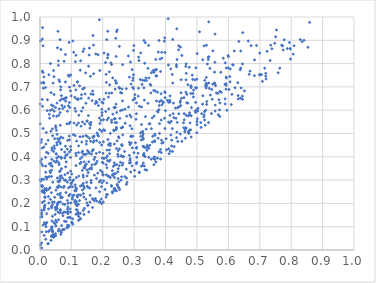
| Category | Series 0 |
|---|---|
| 0.24391119034289943 | 0.937 |
| 0.4676616955791465 | 0.668 |
| 0.5568340997465779 | 0.714 |
| 0.037369161207643664 | 0.389 |
| 0.8533621382588633 | 0.87 |
| 0.10763908088241847 | 0.236 |
| 0.3070902859639657 | 0.436 |
| 0.13458303035295027 | 0.278 |
| 0.3547586632185685 | 0.761 |
| 0.4651976758295102 | 0.73 |
| 0.1837277303432927 | 0.493 |
| 0.14029618347435813 | 0.863 |
| 0.23477067567761456 | 0.515 |
| 0.09814701935426695 | 0.202 |
| 0.14602293796668275 | 0.218 |
| 0.4935495265992197 | 0.73 |
| 0.07887240905222637 | 0.42 |
| 0.20260924000086822 | 0.297 |
| 0.4519171626856099 | 0.466 |
| 0.07965220248888771 | 0.163 |
| 0.041854453100733435 | 0.057 |
| 0.057146219092284456 | 0.939 |
| 0.08839105301547101 | 0.331 |
| 0.05724298066897937 | 0.294 |
| 0.12831150035867 | 0.392 |
| 0.1214229379297539 | 0.649 |
| 0.1949164364507161 | 0.218 |
| 0.013550868993540965 | 0.182 |
| 0.1213459679761526 | 0.646 |
| 0.3762494423564975 | 0.48 |
| 0.7724091463515024 | 0.876 |
| 0.0769640602945596 | 0.088 |
| 0.033231578853792354 | 0.8 |
| 0.14104272610375557 | 0.265 |
| 0.03801853505751707 | 0.439 |
| 0.7942175661114 | 0.891 |
| 0.04299969805753889 | 0.77 |
| 0.11943722633062093 | 0.722 |
| 0.009631824399911615 | 0.876 |
| 0.5242420981090454 | 0.558 |
| 0.5373643796365142 | 0.979 |
| 0.39715830237061955 | 0.911 |
| 0.5618246411263262 | 0.674 |
| 0.2408449500036084 | 0.257 |
| 0.058842929356017426 | 0.205 |
| 0.09546230185449922 | 0.239 |
| 0.1376710891143379 | 0.17 |
| 0.7530375147190279 | 0.944 |
| 0.27501920591225637 | 0.693 |
| 0.3648350697574909 | 0.469 |
| 0.25293504014849844 | 0.434 |
| 0.5329586269067527 | 0.799 |
| 0.8065645198025849 | 0.841 |
| 0.3310262986012268 | 0.414 |
| 0.6000572459547241 | 0.83 |
| 0.22822337867987164 | 0.796 |
| 0.21049090075001964 | 0.754 |
| 0.09763925236492499 | 0.752 |
| 0.01334617480923328 | 0.171 |
| 0.08852334593744193 | 0.156 |
| 0.531127893472464 | 0.706 |
| 0.1401701372584141 | 0.153 |
| 0.21503107951402034 | 0.384 |
| 0.08781193597099624 | 0.106 |
| 0.05449128392824665 | 0.27 |
| 0.2760816050226649 | 0.574 |
| 0.03990961148869476 | 0.49 |
| 0.7329559831619261 | 0.813 |
| 0.00500612260747324 | 0.474 |
| 0.22077620515828122 | 0.765 |
| 0.6054447724367569 | 0.722 |
| 0.32786411738442267 | 0.501 |
| 0.24408991414899306 | 0.547 |
| 0.02527592851926086 | 0.027 |
| 0.11176508920373884 | 0.28 |
| 0.07311101182816859 | 0.147 |
| 0.09266087109593624 | 0.746 |
| 0.2883512260235197 | 0.807 |
| 0.12375368566207612 | 0.317 |
| 0.39871857023153023 | 0.676 |
| 0.4190589228308035 | 0.447 |
| 0.37389502989114665 | 0.595 |
| 0.045309152315040846 | 0.206 |
| 0.5459738909670577 | 0.585 |
| 0.06635398596669262 | 0.08 |
| 0.630844141619654 | 0.663 |
| 0.1520371487880111 | 0.191 |
| 0.4815153798147225 | 0.576 |
| 0.16209924233938278 | 0.669 |
| 0.01787424697789941 | 0.112 |
| 0.183833580432201 | 0.33 |
| 0.04835680129424935 | 0.182 |
| 0.3320016268287741 | 0.361 |
| 0.13812131430080488 | 0.242 |
| 0.05036796216237405 | 0.376 |
| 0.33548523583144896 | 0.89 |
| 0.11575282317948254 | 0.311 |
| 0.3371828985809264 | 0.739 |
| 0.33829220440516306 | 0.439 |
| 0.5992153075573894 | 0.834 |
| 0.07126039271822016 | 0.158 |
| 0.2257562436561359 | 0.803 |
| 0.1695537808601164 | 0.463 |
| 0.20210629621607223 | 0.559 |
| 0.010002813368877761 | 0.248 |
| 0.35996752120817266 | 0.77 |
| 0.40905663588205077 | 0.794 |
| 0.06499897988042957 | 0.206 |
| 0.21772932501088393 | 0.656 |
| 0.15363772788916363 | 0.332 |
| 0.09942400498928683 | 0.285 |
| 0.017709143601316035 | 0.11 |
| 0.5390374761121345 | 0.694 |
| 0.07666512559808392 | 0.273 |
| 0.0810297360074752 | 0.445 |
| 0.01261516489168557 | 0.743 |
| 0.1385718872936993 | 0.41 |
| 0.15552177897999575 | 0.163 |
| 0.035179620852947235 | 0.372 |
| 0.06646640642504109 | 0.861 |
| 0.33110063046381366 | 0.404 |
| 0.036350251875272965 | 0.06 |
| 0.47296785660851015 | 0.503 |
| 0.1567466430509028 | 0.415 |
| 0.4220365788785799 | 0.423 |
| 0.2276618660375751 | 0.277 |
| 0.21710334555512045 | 0.317 |
| 0.12286890321074129 | 0.418 |
| 0.027119326074786954 | 0.079 |
| 0.32505490762666445 | 0.711 |
| 0.3692089511437773 | 0.378 |
| 0.12136918053046808 | 0.152 |
| 0.33106550578878824 | 0.899 |
| 0.0365094979340006 | 0.188 |
| 0.026828627969015528 | 0.229 |
| 0.2104195412271066 | 0.227 |
| 0.4260172147491553 | 0.568 |
| 0.1305548336605895 | 0.376 |
| 0.17628002750769156 | 0.628 |
| 0.2867828753841588 | 0.452 |
| 0.07777179372124354 | 0.3 |
| 0.029168014806775444 | 0.37 |
| 0.41506157272166166 | 0.424 |
| 0.018249361745341086 | 0.334 |
| 0.45683035326969057 | 0.546 |
| 0.4059397169734682 | 0.642 |
| 0.26290747923424207 | 0.64 |
| 0.06280381966456838 | 0.336 |
| 0.3995866083352253 | 0.598 |
| 0.21637919930189808 | 0.84 |
| 0.2458008625685063 | 0.945 |
| 0.21784909808962194 | 0.451 |
| 0.14930825528719205 | 0.202 |
| 0.14381512638113192 | 0.364 |
| 0.06620248454016842 | 0.7 |
| 0.11531677443534283 | 0.405 |
| 0.04340567726124567 | 0.423 |
| 0.22394999945142557 | 0.5 |
| 0.24902716734299069 | 0.402 |
| 0.33250158228532567 | 0.643 |
| 0.2107927867806445 | 0.366 |
| 0.6044154133689477 | 0.744 |
| 0.12304580895910378 | 0.447 |
| 0.3205721304432393 | 0.503 |
| 0.11453131640212688 | 0.362 |
| 0.24336901556658708 | 0.254 |
| 0.5289069425456816 | 0.695 |
| 0.43308419497787587 | 0.565 |
| 0.020131904621663477 | 0.504 |
| 0.18221831568649927 | 0.502 |
| 0.6112427681295874 | 0.668 |
| 0.3796588719378181 | 0.62 |
| 0.6333083493232284 | 0.895 |
| 0.09731579626018472 | 0.444 |
| 0.08329879675574658 | 0.654 |
| 0.0597645063752007 | 0.276 |
| 0.2819458302699722 | 0.613 |
| 0.04960586954992552 | 0.061 |
| 0.19242306354370342 | 0.341 |
| 0.6450414746218305 | 0.647 |
| 0.028026186642425177 | 0.202 |
| 0.31497934864571475 | 0.813 |
| 0.34978864139958665 | 0.542 |
| 0.027619665534519888 | 0.26 |
| 0.19704750932538728 | 0.635 |
| 0.471708844169331 | 0.575 |
| 0.05225975668607408 | 0.181 |
| 0.10035035625800193 | 0.118 |
| 0.06487783764590704 | 0.244 |
| 0.447296856135428 | 0.871 |
| 0.38593318696827317 | 0.558 |
| 0.39276282123732453 | 0.635 |
| 0.14365675844474612 | 0.351 |
| 0.23788242376544522 | 0.264 |
| 0.039416278083651335 | 0.52 |
| 0.10474060780096517 | 0.897 |
| 0.07855093386671375 | 0.615 |
| 0.5774065834117159 | 0.677 |
| 0.3653997894245161 | 0.465 |
| 0.22414032779835225 | 0.311 |
| 0.0400539780893836 | 0.078 |
| 0.189655941982942 | 0.42 |
| 0.4167571494637532 | 0.493 |
| 0.03231875957370556 | 0.599 |
| 0.08336473902203456 | 0.122 |
| 0.5663840031707861 | 0.672 |
| 0.07518955673254435 | 0.268 |
| 0.25872605323134223 | 0.404 |
| 0.5022199502921738 | 0.596 |
| 0.06709992255150754 | 0.398 |
| 0.08708060352033276 | 0.41 |
| 0.4593301695234616 | 0.559 |
| 0.15477775722895126 | 0.789 |
| 0.3389906638367006 | 0.728 |
| 0.044669035583485894 | 0.668 |
| 0.2007280348145316 | 0.415 |
| 0.4621563726328265 | 0.515 |
| 0.48238591989024426 | 0.611 |
| 0.10617644381522706 | 0.495 |
| 0.00851352465027444 | 0.362 |
| 0.015004876473736939 | 0.263 |
| 0.06630353566093683 | 0.067 |
| 0.10646827346490739 | 0.301 |
| 0.30709330130360835 | 0.632 |
| 0.05474401337547852 | 0.176 |
| 0.032119174686702334 | 0.268 |
| 0.41322496184319935 | 0.637 |
| 0.00812733514930919 | 0.617 |
| 0.37929487718063015 | 0.422 |
| 0.04149142046565413 | 0.066 |
| 0.1692578703910187 | 0.668 |
| 0.28134606186685107 | 0.833 |
| 0.37438017180568484 | 0.677 |
| 0.7188979724070081 | 0.746 |
| 0.47103846005440475 | 0.709 |
| 0.020946958870489807 | 0.419 |
| 0.1191627517572521 | 0.227 |
| 0.16258102240819694 | 0.298 |
| 0.6152197376340832 | 0.794 |
| 0.2885927721657533 | 0.488 |
| 0.058345275428042354 | 0.082 |
| 0.20195964931218113 | 0.464 |
| 0.02072601733507695 | 0.255 |
| 0.6989868220949436 | 0.752 |
| 0.06808325650193858 | 0.226 |
| 0.08685130270710895 | 0.163 |
| 0.5901048361539656 | 0.803 |
| 0.201669110964377 | 0.323 |
| 0.15035079300200815 | 0.343 |
| 0.006731801129953863 | 0.272 |
| 0.48121003934415896 | 0.696 |
| 0.04825014065972355 | 0.153 |
| 0.3757332978266741 | 0.592 |
| 0.2847829143418412 | 0.742 |
| 0.722979123322508 | 0.853 |
| 0.1149118563847028 | 0.836 |
| 0.31664459084436314 | 0.332 |
| 0.3057557205889001 | 0.561 |
| 0.007488862757127346 | 0.905 |
| 0.2935476959820621 | 0.774 |
| 0.3922369073166386 | 0.632 |
| 0.7745293979132577 | 0.858 |
| 0.6392601512715694 | 0.781 |
| 0.4495201165588044 | 0.731 |
| 0.06715317241475949 | 0.319 |
| 0.04695456929501407 | 0.226 |
| 0.23532462788405528 | 0.327 |
| 0.18063969051697693 | 0.21 |
| 0.01402624115927198 | 0.19 |
| 0.10306407123330319 | 0.219 |
| 0.5178056027095175 | 0.626 |
| 0.2927085651272069 | 0.52 |
| 0.2605449974083912 | 0.453 |
| 0.042829937651195915 | 0.575 |
| 0.03780532272443249 | 0.429 |
| 0.16303323684526816 | 0.354 |
| 0.11908174501634561 | 0.721 |
| 0.17663911929899667 | 0.221 |
| 0.43871501277675673 | 0.466 |
| 0.19840518566090193 | 0.395 |
| 0.6998271759013706 | 0.845 |
| 0.23644887430507477 | 0.374 |
| 0.1676565687572823 | 0.682 |
| 0.019659382751804788 | 0.078 |
| 0.21407717531590997 | 0.404 |
| 0.24130260082379096 | 0.909 |
| 0.4996953430218478 | 0.733 |
| 0.12278565135103403 | 0.127 |
| 0.0732837183429994 | 0.197 |
| 0.2357448563241168 | 0.263 |
| 0.4135430973665202 | 0.546 |
| 0.00754470494884385 | 0.204 |
| 0.017701315847946764 | 0.398 |
| 0.18073455191501842 | 0.469 |
| 0.3291251538454806 | 0.475 |
| 0.15917759375607055 | 0.206 |
| 0.7188386147812499 | 0.758 |
| 0.16702842083407998 | 0.221 |
| 0.095837884400932 | 0.176 |
| 0.05174239849955142 | 0.412 |
| 0.23703291020405137 | 0.563 |
| 0.2390515693272578 | 0.563 |
| 0.37403816150424085 | 0.395 |
| 0.044003426879097085 | 0.382 |
| 0.26465052816567014 | 0.4 |
| 0.23080040011629133 | 0.323 |
| 0.29023603620723115 | 0.571 |
| 0.8409692116301517 | 0.9 |
| 0.39804362823671546 | 0.521 |
| 0.2605347705392679 | 0.448 |
| 0.24902073172104 | 0.349 |
| 0.24548002902089272 | 0.468 |
| 0.2037597117867438 | 0.393 |
| 0.05993368208260408 | 0.375 |
| 0.1118468830607855 | 0.491 |
| 0.023612165951121256 | 0.645 |
| 0.5011194826142569 | 0.563 |
| 0.22339906344496774 | 0.386 |
| 0.04831061342525378 | 0.112 |
| 0.20081631364001995 | 0.63 |
| 0.009317921766800241 | 0.762 |
| 0.4348515015571176 | 0.482 |
| 0.5715474916732717 | 0.601 |
| 0.527196873744013 | 0.707 |
| 0.23530805491004214 | 0.255 |
| 0.09821572217270291 | 0.429 |
| 0.14619851287386842 | 0.63 |
| 0.05870105396116221 | 0.792 |
| 0.5004885150410147 | 0.843 |
| 0.0006069534296898604 | 0.542 |
| 0.4672429281778535 | 0.632 |
| 0.06416174020294663 | 0.46 |
| 0.2888275354814467 | 0.335 |
| 0.22800931465566376 | 0.547 |
| 0.297688285828555 | 0.857 |
| 0.7155078956638191 | 0.78 |
| 0.006360093373892095 | 0.142 |
| 0.005389969397652905 | 0.009 |
| 0.03510632433440486 | 0.041 |
| 0.032874599871368204 | 0.217 |
| 0.2602759630639562 | 0.674 |
| 0.2658284845283092 | 0.401 |
| 0.12717690661811343 | 0.371 |
| 0.11372448314397543 | 0.595 |
| 0.5357638685075514 | 0.818 |
| 0.2016109384396545 | 0.206 |
| 0.5930142384740444 | 0.781 |
| 0.38551660851334213 | 0.67 |
| 0.044705088040813634 | 0.065 |
| 0.3980662967305558 | 0.848 |
| 0.1350772375083955 | 0.342 |
| 0.03890689447034401 | 0.206 |
| 0.2371538757759154 | 0.311 |
| 0.038015879500287286 | 0.099 |
| 0.17204907245896217 | 0.389 |
| 0.0013419761563929766 | 0.381 |
| 0.05728253230582814 | 0.268 |
| 0.11474278217049771 | 0.153 |
| 0.3282294047257669 | 0.445 |
| 0.11383831373518671 | 0.415 |
| 0.24789757257065514 | 0.411 |
| 0.15527646318582766 | 0.42 |
| 0.2164700230221417 | 0.837 |
| 0.28639378056401743 | 0.579 |
| 0.05073269095140798 | 0.103 |
| 0.11050713649224919 | 0.206 |
| 0.3869693838035909 | 0.471 |
| 0.03739040704248364 | 0.057 |
| 0.05633241380254217 | 0.239 |
| 0.3548737749796932 | 0.521 |
| 0.0030302434648611376 | 0.717 |
| 0.189456665549948 | 0.566 |
| 0.5182795619210426 | 0.816 |
| 0.5568985450863178 | 0.806 |
| 0.5590804853402603 | 0.706 |
| 0.1732726132414264 | 0.321 |
| 0.24221678822412485 | 0.626 |
| 0.09346431069213545 | 0.633 |
| 0.3290570417238827 | 0.373 |
| 0.47975153761631195 | 0.516 |
| 0.10751630028247028 | 0.849 |
| 0.24368509245997372 | 0.718 |
| 0.6404978432161512 | 0.695 |
| 0.15858606809294584 | 0.265 |
| 0.2133919188114779 | 0.558 |
| 0.6444253964788951 | 0.66 |
| 0.47090523226269654 | 0.63 |
| 0.013933069920114005 | 0.117 |
| 0.592851334667067 | 0.742 |
| 0.41927499698000703 | 0.472 |
| 0.4019191011697917 | 0.478 |
| 0.1970930375920913 | 0.577 |
| 0.25852601241839535 | 0.524 |
| 0.34373993966160166 | 0.63 |
| 0.19736882452102855 | 0.59 |
| 0.6632895011169548 | 0.897 |
| 0.4777190510350623 | 0.545 |
| 0.22399127195049395 | 0.448 |
| 0.3688331476442036 | 0.818 |
| 0.08377410876833313 | 0.378 |
| 0.31212218950666915 | 0.415 |
| 0.5217167218147444 | 0.572 |
| 0.57242691533535 | 0.573 |
| 0.05526811713123658 | 0.192 |
| 0.3717794339564151 | 0.747 |
| 0.2518460163586982 | 0.698 |
| 0.06976841847728354 | 0.648 |
| 0.3767890768757788 | 0.849 |
| 0.4492736743034257 | 0.675 |
| 0.05130703883694143 | 0.413 |
| 0.09109926228196208 | 0.105 |
| 0.06960560981984987 | 0.62 |
| 0.10348348876267455 | 0.294 |
| 0.15122555753401634 | 0.487 |
| 0.06411061449171196 | 0.316 |
| 0.2419152266443062 | 0.716 |
| 0.23955913673453244 | 0.611 |
| 0.06361559998975208 | 0.298 |
| 0.04516585475423296 | 0.446 |
| 0.30148427983419346 | 0.316 |
| 0.050083983233369156 | 0.128 |
| 0.3802678310677482 | 0.636 |
| 0.46119662194679834 | 0.507 |
| 0.3380831926709341 | 0.519 |
| 0.23823158525702792 | 0.564 |
| 0.17232094629228756 | 0.489 |
| 0.3495208895310845 | 0.449 |
| 0.016258657854456793 | 0.229 |
| 0.5923987706267344 | 0.713 |
| 0.0818536830767147 | 0.405 |
| 0.09368991024250639 | 0.421 |
| 0.21998752761186346 | 0.38 |
| 0.06839426800611348 | 0.393 |
| 0.30690799912816524 | 0.585 |
| 0.26286296089585115 | 0.526 |
| 0.03515960457315093 | 0.362 |
| 0.3590392576317981 | 0.488 |
| 0.1548791323481492 | 0.652 |
| 0.11556492262074936 | 0.264 |
| 0.027246573008352315 | 0.177 |
| 0.682757227691434 | 0.748 |
| 0.10274609405862778 | 0.224 |
| 0.038215120661922564 | 0.125 |
| 0.13210574486941573 | 0.596 |
| 0.08158100333556051 | 0.357 |
| 0.20279456062880785 | 0.516 |
| 0.16403609994328305 | 0.348 |
| 0.15263594161090943 | 0.192 |
| 0.05456583464167308 | 0.496 |
| 0.13537962420944427 | 0.424 |
| 0.5145638971872301 | 0.585 |
| 0.4849670429093448 | 0.751 |
| 0.4995356432093673 | 0.503 |
| 0.3403322567538454 | 0.428 |
| 0.07748235031062767 | 0.65 |
| 0.5923408668261195 | 0.69 |
| 0.24334186804058566 | 0.522 |
| 0.29543682653554204 | 0.698 |
| 0.05525296561281001 | 0.309 |
| 0.12826382529874314 | 0.772 |
| 0.2916448196887982 | 0.487 |
| 0.08811230791206959 | 0.47 |
| 0.23597665027331027 | 0.612 |
| 0.07935843509809493 | 0.323 |
| 0.4870756903830429 | 0.672 |
| 0.10430791431189945 | 0.232 |
| 0.05331719137237423 | 0.46 |
| 0.4344669480259722 | 0.795 |
| 0.061436587640393614 | 0.606 |
| 0.44371819029191295 | 0.615 |
| 0.2034950164884971 | 0.647 |
| 0.24004847901432524 | 0.727 |
| 0.3921893567047102 | 0.461 |
| 0.16386274838857284 | 0.412 |
| 0.2297517891062194 | 0.249 |
| 0.2846247067124047 | 0.373 |
| 0.6391648756079369 | 0.854 |
| 0.015626774917182562 | 0.192 |
| 0.2873974289737812 | 0.392 |
| 0.019837698728314312 | 0.264 |
| 0.006626614573478906 | 0.437 |
| 0.049651012799649896 | 0.07 |
| 0.28477606266076316 | 0.406 |
| 0.19757514638222484 | 0.288 |
| 0.030563173381100595 | 0.084 |
| 0.062470380943389414 | 0.159 |
| 0.17043902928406884 | 0.879 |
| 0.029700420516063475 | 0.582 |
| 0.2901557157050775 | 0.712 |
| 0.5926776534106079 | 0.707 |
| 0.11174725858962298 | 0.213 |
| 0.30095009734379685 | 0.342 |
| 0.13797187751489337 | 0.313 |
| 0.297642295311107 | 0.752 |
| 0.018600081800082546 | 0.314 |
| 0.46571495288442866 | 0.758 |
| 0.05093366594470983 | 0.257 |
| 0.3266008677973976 | 0.362 |
| 0.21488563414065465 | 0.238 |
| 0.15388899243564325 | 0.577 |
| 0.17993938464694215 | 0.307 |
| 0.10830550995463506 | 0.545 |
| 0.41416089463766514 | 0.661 |
| 0.14756941697507686 | 0.454 |
| 0.1436569665661216 | 0.67 |
| 0.7083610465890673 | 0.723 |
| 0.5035066191053624 | 0.608 |
| 0.34166733015580997 | 0.449 |
| 0.41831546057970803 | 0.553 |
| 0.383925297028337 | 0.431 |
| 0.005558175815978061 | 0.17 |
| 0.2131418166882968 | 0.288 |
| 0.17798375027085456 | 0.267 |
| 0.03652113272336188 | 0.316 |
| 0.09894368082708482 | 0.286 |
| 0.7585145861426057 | 0.761 |
| 0.07242049091745262 | 0.608 |
| 0.06876308995020886 | 0.105 |
| 0.16619955802019493 | 0.424 |
| 0.11436664136507535 | 0.196 |
| 0.5896951303708007 | 0.649 |
| 0.041804898580436234 | 0.716 |
| 0.16951463842985837 | 0.487 |
| 0.2382987280865262 | 0.364 |
| 0.0137259060389745 | 0.21 |
| 0.08210405942366317 | 0.3 |
| 0.03647041703042431 | 0.623 |
| 0.018101273893403436 | 0.36 |
| 0.18977201344953587 | 0.646 |
| 0.0685244788196393 | 0.432 |
| 0.797771461734739 | 0.819 |
| 0.09327396748280625 | 0.141 |
| 0.34708745300880117 | 0.738 |
| 0.36279974382393854 | 0.366 |
| 0.26124782776050415 | 0.449 |
| 0.5500750564285695 | 0.712 |
| 0.042530415616007455 | 0.618 |
| 0.05932153622416836 | 0.13 |
| 0.3232688522684556 | 0.614 |
| 0.4647189093893802 | 0.677 |
| 0.06439693092483834 | 0.341 |
| 0.06413773595172856 | 0.642 |
| 0.3647174481923142 | 0.399 |
| 0.45841203118756646 | 0.654 |
| 0.23116297677172137 | 0.245 |
| 0.06582157416705414 | 0.687 |
| 0.25003616589207467 | 0.486 |
| 0.16570177113456974 | 0.366 |
| 0.08095774426581681 | 0.721 |
| 0.07225851993652499 | 0.087 |
| 0.19044110268855596 | 0.77 |
| 0.1996831115650365 | 0.323 |
| 0.03180171974087387 | 0.338 |
| 0.3207871819502365 | 0.488 |
| 0.5468715686281445 | 0.689 |
| 0.4764270997757907 | 0.579 |
| 0.01352694610773908 | 0.18 |
| 0.00472559523732663 | 0.03 |
| 0.03958277849082148 | 0.145 |
| 0.21567975135763295 | 0.939 |
| 0.4729199308086458 | 0.508 |
| 0.026555165676461323 | 0.027 |
| 0.27135915273114086 | 0.544 |
| 0.5259495193349161 | 0.536 |
| 0.034991647948645066 | 0.675 |
| 0.07173802475963742 | 0.309 |
| 0.2639263623467817 | 0.372 |
| 0.438864645849928 | 0.611 |
| 0.10090725066565853 | 0.326 |
| 0.12936290222852542 | 0.812 |
| 0.053497416838123035 | 0.394 |
| 0.4418980890389822 | 0.876 |
| 0.09679264298100398 | 0.683 |
| 0.2882855343219196 | 0.376 |
| 0.4505766429785406 | 0.651 |
| 0.08269850954020108 | 0.247 |
| 0.6060765319426766 | 0.777 |
| 0.0032498185600394747 | 0.276 |
| 0.004741072611128216 | 0.16 |
| 0.3022694116225835 | 0.667 |
| 0.06403065020547327 | 0.589 |
| 0.42140253547240625 | 0.753 |
| 0.30777562632269617 | 0.44 |
| 0.28462456056612173 | 0.462 |
| 0.14006940469424067 | 0.353 |
| 0.24879238383631186 | 0.306 |
| 0.16591903481362846 | 0.641 |
| 0.5554482604085909 | 0.717 |
| 0.05401503193490931 | 0.451 |
| 0.36734858983231844 | 0.682 |
| 0.18921876254014036 | 0.988 |
| 0.27723267832919973 | 0.29 |
| 0.10337746783518542 | 0.271 |
| 0.49868983096883446 | 0.696 |
| 0.23920639361331186 | 0.547 |
| 0.16954131225738256 | 0.431 |
| 0.30811468425837973 | 0.376 |
| 0.18192276528672668 | 0.38 |
| 0.11067710302771694 | 0.655 |
| 0.23784426760840816 | 0.612 |
| 0.7385876318754273 | 0.864 |
| 0.19625587380149045 | 0.199 |
| 0.6208608433253063 | 0.696 |
| 0.043006353539883246 | 0.056 |
| 0.09197983191716008 | 0.233 |
| 0.46316955975552654 | 0.48 |
| 0.3270835495058053 | 0.509 |
| 0.05827761755544336 | 0.812 |
| 0.11753949473414249 | 0.233 |
| 0.22863171982871477 | 0.674 |
| 0.2130303560246254 | 0.353 |
| 0.04977959190521075 | 0.172 |
| 0.4813839359064229 | 0.485 |
| 0.036213930237925185 | 0.093 |
| 0.1150818844018845 | 0.173 |
| 0.06043279511690902 | 0.089 |
| 0.1397077440265001 | 0.273 |
| 0.17773319719412073 | 0.842 |
| 0.056119423269287316 | 0.478 |
| 0.24261655530943804 | 0.831 |
| 0.12592078445968014 | 0.212 |
| 0.2955022701395421 | 0.489 |
| 0.054961893608680534 | 0.198 |
| 0.09704365693939121 | 0.163 |
| 0.2869272309811093 | 0.533 |
| 0.3155796529600976 | 0.334 |
| 0.19587323228412823 | 0.272 |
| 0.24893304456644327 | 0.426 |
| 0.0003193576583736535 | 0.302 |
| 0.5360670339111678 | 0.827 |
| 0.1202556439057546 | 0.161 |
| 0.3659823229012613 | 0.492 |
| 0.18120565437789904 | 0.634 |
| 0.030752639995413222 | 0.565 |
| 0.04671533251344695 | 0.478 |
| 0.3883140047526835 | 0.623 |
| 0.7504299054120325 | 0.915 |
| 0.3636281791379685 | 0.575 |
| 0.0931586088183215 | 0.489 |
| 0.1493713775628348 | 0.552 |
| 0.32317644980430105 | 0.538 |
| 0.23918392896098883 | 0.69 |
| 0.2039368602033953 | 0.845 |
| 0.6385113762363487 | 0.651 |
| 0.25287433248741453 | 0.874 |
| 0.2587741296311984 | 0.403 |
| 0.0874932477944439 | 0.596 |
| 0.3709814551673961 | 0.64 |
| 0.42726660427117547 | 0.444 |
| 0.1901072433954194 | 0.461 |
| 0.03450951253089596 | 0.51 |
| 0.2748937787235567 | 0.347 |
| 0.6456316879751368 | 0.933 |
| 0.4743737151264039 | 0.501 |
| 0.049904410773508934 | 0.533 |
| 0.0938349240095081 | 0.699 |
| 0.8586175834199797 | 0.977 |
| 0.2562726356821119 | 0.598 |
| 0.11689735451661676 | 0.536 |
| 0.37110343591368145 | 0.774 |
| 0.5426907695134205 | 0.665 |
| 0.1285079672473639 | 0.157 |
| 0.039663882981753384 | 0.062 |
| 0.038702029382020386 | 0.099 |
| 0.13522770707091547 | 0.258 |
| 0.12896947749646137 | 0.135 |
| 0.24399909507846773 | 0.367 |
| 0.1185209028963995 | 0.19 |
| 0.6377865316640432 | 0.773 |
| 0.49993827816221736 | 0.538 |
| 0.1603200621544817 | 0.745 |
| 0.08819646749798327 | 0.138 |
| 0.49993544083356833 | 0.551 |
| 0.07925362004080161 | 0.196 |
| 0.15274266351012444 | 0.269 |
| 0.5558962102295659 | 0.763 |
| 0.2536600149149264 | 0.259 |
| 0.18940614259802324 | 0.205 |
| 0.10229387170857485 | 0.118 |
| 0.025762814406259604 | 0.471 |
| 0.380605366358422 | 0.5 |
| 0.5897695752050481 | 0.627 |
| 0.2179811473757478 | 0.566 |
| 0.2976916015517945 | 0.693 |
| 0.2525646214048488 | 0.362 |
| 0.09593839598504261 | 0.549 |
| 0.6298035915272302 | 0.718 |
| 0.38618792663755463 | 0.642 |
| 0.14257050797475945 | 0.54 |
| 0.4366388371651758 | 0.817 |
| 0.008072016443733676 | 0.954 |
| 0.11091675448829852 | 0.254 |
| 0.038525379842155094 | 0.086 |
| 0.1747034866035817 | 0.368 |
| 0.3358802396881856 | 0.572 |
| 0.04078898109493567 | 0.291 |
| 0.518863564492931 | 0.662 |
| 0.3690146506286762 | 0.747 |
| 0.14534774775189607 | 0.76 |
| 0.21113688424099353 | 0.396 |
| 0.06270045669463953 | 0.723 |
| 0.27564769673376355 | 0.308 |
| 0.14166247320706316 | 0.179 |
| 0.7696296826158284 | 0.879 |
| 0.3628898163996217 | 0.762 |
| 0.45805497666672046 | 0.525 |
| 0.689485018296295 | 0.878 |
| 0.19078400940359275 | 0.208 |
| 0.33095804754739244 | 0.443 |
| 0.08866515111213602 | 0.185 |
| 0.07625879858198059 | 0.647 |
| 0.5301652103685429 | 0.879 |
| 0.7965626045072987 | 0.865 |
| 0.2966052302444201 | 0.738 |
| 0.29543254996634316 | 0.728 |
| 0.2457189219588336 | 0.281 |
| 0.03332366891804961 | 0.332 |
| 0.8091397464212778 | 0.876 |
| 0.7473886990438187 | 0.887 |
| 0.22201627145582048 | 0.314 |
| 0.46425539612431366 | 0.788 |
| 0.43566017918763733 | 0.949 |
| 0.3320824055823898 | 0.441 |
| 0.30214911128197 | 0.649 |
| 0.32260998590021794 | 0.472 |
| 0.3789577279819196 | 0.899 |
| 0.26110685515478127 | 0.691 |
| 0.21272789508229983 | 0.903 |
| 0.007754293900507414 | 0.255 |
| 0.013261110899558504 | 0.063 |
| 0.3838648090757152 | 0.766 |
| 0.25615627315246114 | 0.377 |
| 0.18607484767469806 | 0.62 |
| 0.3879194359158523 | 0.823 |
| 0.008236799330971434 | 0.275 |
| 0.21185712657930522 | 0.238 |
| 0.12610099730046131 | 0.704 |
| 0.08608804750966947 | 0.542 |
| 0.7776217248925021 | 0.902 |
| 0.090955540306211 | 0.267 |
| 0.019202585167718778 | 0.1 |
| 0.05927617934513074 | 0.401 |
| 0.38789629785998536 | 0.458 |
| 0.12891346804092163 | 0.274 |
| 0.16963948226615921 | 0.217 |
| 0.13517133544290627 | 0.55 |
| 0.11119603294085312 | 0.608 |
| 0.7346786217072804 | 0.879 |
| 0.4241406656285981 | 0.585 |
| 0.018634442649668292 | 0.454 |
| 0.44139103147873204 | 0.859 |
| 0.30827833335889865 | 0.398 |
| 0.4469356836611609 | 0.498 |
| 0.3457519565382129 | 0.878 |
| 0.39585387269982864 | 0.896 |
| 0.4954726251871374 | 0.634 |
| 0.4886054483219959 | 0.657 |
| 0.4138349523009308 | 0.578 |
| 0.13310307318875914 | 0.463 |
| 0.16297117510445291 | 0.289 |
| 0.18466922997459212 | 0.838 |
| 0.2630405118460214 | 0.527 |
| 0.0133518045177905 | 0.255 |
| 0.11874352743834715 | 0.172 |
| 0.06478165422656212 | 0.456 |
| 0.41096531269946934 | 0.413 |
| 0.42126842462004144 | 0.521 |
| 0.03632123594429015 | 0.246 |
| 0.47526271694734556 | 0.784 |
| 0.2708598532567025 | 0.605 |
| 0.1928623137742822 | 0.299 |
| 0.31919981719687895 | 0.732 |
| 0.12817253777749738 | 0.134 |
| 0.5728439268239868 | 0.681 |
| 0.1405410411849204 | 0.378 |
| 0.33480059531793516 | 0.401 |
| 0.15662796202794027 | 0.837 |
| 0.3966898756583479 | 0.565 |
| 0.005573971127014632 | 0.078 |
| 0.8289033544694976 | 0.903 |
| 0.5698137439999554 | 0.645 |
| 0.5245876222993391 | 0.728 |
| 0.0017984036058593666 | 0.021 |
| 0.05323425001792703 | 0.179 |
| 0.0647740583462405 | 0.535 |
| 0.4812304985613103 | 0.704 |
| 0.25143748238037145 | 0.481 |
| 0.0388440728370143 | 0.603 |
| 0.4369043984848 | 0.548 |
| 0.11664164009721112 | 0.468 |
| 0.11538721454298873 | 0.259 |
| 0.045069826978243355 | 0.595 |
| 0.14985755895423736 | 0.318 |
| 0.14294899098139058 | 0.41 |
| 0.005460463781325586 | 0.153 |
| 0.23688640739359812 | 0.455 |
| 0.0513851956256004 | 0.185 |
| 0.19837833961397577 | 0.376 |
| 0.013194471733961821 | 0.246 |
| 0.13073540512695792 | 0.531 |
| 0.15964167235903004 | 0.235 |
| 0.009581481049711793 | 0.521 |
| 0.40814785138838283 | 0.992 |
| 0.24337498103719768 | 0.526 |
| 0.06644256963181683 | 0.27 |
| 0.3291551212822693 | 0.408 |
| 0.2243926115271626 | 0.456 |
| 0.017747715416753462 | 0.697 |
| 0.12272122273274733 | 0.237 |
| 0.3139915830445642 | 0.828 |
| 0.43603856768164084 | 0.506 |
| 0.18028951182695652 | 0.633 |
| 0.3437884847235282 | 0.78 |
| 0.04944708485945992 | 0.611 |
| 0.44637233790966024 | 0.633 |
| 0.567815683926207 | 0.58 |
| 0.08095733640900593 | 0.839 |
| 0.054207572509238466 | 0.63 |
| 0.05573133167763722 | 0.868 |
| 0.24621911331760205 | 0.279 |
| 0.16737757448305546 | 0.183 |
| 0.15744741747992042 | 0.867 |
| 0.006485906876120828 | 0.251 |
| 0.5838589394502921 | 0.823 |
| 0.40999369750032566 | 0.434 |
| 0.07311028822926013 | 0.481 |
| 0.15738487965791237 | 0.348 |
| 0.0711539665438694 | 0.226 |
| 0.13716483557393555 | 0.322 |
| 0.6661697792961451 | 0.754 |
| 0.26241875731860076 | 0.365 |
| 0.2993215553591546 | 0.418 |
| 0.5582034146889888 | 0.622 |
| 0.330879927487741 | 0.696 |
| 0.05331192829049547 | 0.12 |
| 0.4227346936780192 | 0.717 |
| 0.49621662599225735 | 0.782 |
| 0.08263075389782826 | 0.652 |
| 0.7636486000705172 | 0.781 |
| 0.07788726504853849 | 0.124 |
| 0.07320666020705036 | 0.087 |
| 0.060185822566394376 | 0.578 |
| 0.3980207518910789 | 0.654 |
| 0.015584187376889713 | 0.225 |
| 0.30148522117556764 | 0.652 |
| 0.522656697472265 | 0.876 |
| 0.5226909361673551 | 0.58 |
| 0.021970919517232512 | 0.118 |
| 0.04422246947281616 | 0.117 |
| 0.23539721572833316 | 0.512 |
| 0.3531875263948644 | 0.707 |
| 0.06802234294755638 | 0.075 |
| 0.09760567111052065 | 0.339 |
| 0.09162033096765276 | 0.104 |
| 0.17257838048301488 | 0.469 |
| 0.2563686864107424 | 0.676 |
| 0.06867662464751312 | 0.349 |
| 0.6510807732214111 | 0.683 |
| 0.14851379973871492 | 0.29 |
| 0.16114970748241775 | 0.537 |
| 0.3127415346627005 | 0.66 |
| 0.5410747869029007 | 0.779 |
| 0.49571530136218644 | 0.591 |
| 0.4029231248560351 | 0.43 |
| 0.5379707587527336 | 0.829 |
| 0.46575547981673215 | 0.578 |
| 0.6093620217326643 | 0.624 |
| 0.01394969323980777 | 0.244 |
| 0.34622179256866026 | 0.398 |
| 0.10462022077569333 | 0.11 |
| 0.49443810635553653 | 0.595 |
| 0.2091732551319645 | 0.595 |
| 0.27042188686151847 | 0.315 |
| 0.006242282818215927 | 0.276 |
| 0.3207970850562297 | 0.846 |
| 0.7003967075107498 | 0.754 |
| 0.004913199886849462 | 0.37 |
| 0.19684402152804026 | 0.509 |
| 0.023387109373354864 | 0.311 |
| 0.1943751728414128 | 0.556 |
| 0.5080856523412441 | 0.936 |
| 0.1223423906472958 | 0.196 |
| 0.10800383395311575 | 0.706 |
| 0.5731177215252423 | 0.631 |
| 0.09397799214191593 | 0.473 |
| 0.05694188761773056 | 0.163 |
| 0.09512349609584447 | 0.311 |
| 0.40896513345256214 | 0.635 |
| 0.17081227036297786 | 0.756 |
| 0.5578704614360606 | 0.596 |
| 0.24919350901675286 | 0.27 |
| 0.061144919106914664 | 0.367 |
| 0.08681519240533331 | 0.433 |
| 0.34747974716861285 | 0.541 |
| 0.018218556174068534 | 0.046 |
| 0.2113226954114058 | 0.72 |
| 0.0023734975588250995 | 0.141 |
| 0.5302399767418775 | 0.715 |
| 0.1792885418668786 | 0.415 |
| 0.8348369154061328 | 0.894 |
| 0.5286853702453771 | 0.7 |
| 0.1140541358946866 | 0.254 |
| 0.36566206274187096 | 0.497 |
| 0.12322791799310884 | 0.144 |
| 0.011727984018034987 | 0.303 |
| 0.13414097287209936 | 0.399 |
| 0.36222097574608625 | 0.685 |
| 0.08534839271167716 | 0.095 |
| 0.0905990026454655 | 0.619 |
| 0.1622538899280982 | 0.547 |
| 0.059434963466501456 | 0.467 |
| 0.08987515541857127 | 0.165 |
| 0.056870582124000424 | 0.201 |
| 0.12242566129419508 | 0.545 |
| 0.5277777687316185 | 0.599 |
| 0.14776565777774708 | 0.412 |
| 0.498460749193988 | 0.602 |
| 0.09662902540658858 | 0.139 |
| 0.5366745314752284 | 0.547 |
| 0.22151708185002883 | 0.414 |
| 0.25811171644478426 | 0.299 |
| 0.14809404998945153 | 0.467 |
| 0.09714569660041739 | 0.397 |
| 0.01061937698727633 | 0.694 |
| 0.053517445293769006 | 0.574 |
| 0.36719755511594465 | 0.774 |
| 0.23028343225501624 | 0.341 |
| 0.063333069320341 | 0.306 |
| 0.25355172813517324 | 0.694 |
| 0.1785651313359904 | 0.638 |
| 0.5312622096310496 | 0.637 |
| 0.09299934269266452 | 0.543 |
| 0.1612820085156521 | 0.467 |
| 0.20594909248583226 | 0.513 |
| 0.44703166631354907 | 0.64 |
| 0.6316851016803385 | 0.648 |
| 0.2208501525643607 | 0.673 |
| 0.44795914378712887 | 0.62 |
| 0.2216395296353062 | 0.709 |
| 0.25144430179938215 | 0.266 |
| 0.15770616564552153 | 0.543 |
| 0.02158688292916655 | 0.305 |
| 0.1687328683066036 | 0.921 |
| 0.169042287253781 | 0.483 |
| 0.24804035735349295 | 0.335 |
| 0.293110359656121 | 0.361 |
| 0.4165311583279617 | 0.777 |
| 0.22816685104669643 | 0.557 |
| 0.012027922142750058 | 0.441 |
| 0.07894130957545764 | 0.395 |
| 0.021275071468792373 | 0.156 |
| 0.13628586686367594 | 0.691 |
| 0.0026241558495779804 | 0.295 |
| 0.038861307277873736 | 0.36 |
| 0.5993651006070368 | 0.782 |
| 0.7200521574289882 | 0.734 |
| 0.4316244511503011 | 0.609 |
| 0.15054983066278993 | 0.274 |
| 0.4763345813515629 | 0.589 |
| 0.13691813796108443 | 0.852 |
| 0.2542961145286783 | 0.565 |
| 0.5507014551608517 | 0.854 |
| 0.012181968277277244 | 0.716 |
| 0.24399891895374148 | 0.59 |
| 0.23194955705293263 | 0.583 |
| 0.4803522644813113 | 0.672 |
| 0.33344478620013485 | 0.801 |
| 0.19009537303231072 | 0.516 |
| 0.036811466032100726 | 0.343 |
| 0.4653652470802693 | 0.799 |
| 0.6689911067930097 | 0.768 |
| 0.06666290274636655 | 0.485 |
| 0.0653699909032146 | 0.173 |
| 0.09658361476178912 | 0.272 |
| 0.27520092175358135 | 0.282 |
| 0.22118779317070658 | 0.457 |
| 0.006699273146618889 | 0.304 |
| 0.13352285585720602 | 0.419 |
| 0.12922194475181492 | 0.235 |
| 0.4348257944544839 | 0.787 |
| 0.12746896360362547 | 0.486 |
| 0.17317262983078618 | 0.212 |
| 0.38765250698711984 | 0.848 |
| 0.5238240536954478 | 0.594 |
| 0.0537852742467293 | 0.382 |
| 0.08722209397393099 | 0.291 |
| 0.5934542635492656 | 0.738 |
| 0.05236941093888137 | 0.514 |
| 0.12149395192651091 | 0.161 |
| 0.11362345221210235 | 0.269 |
| 0.15902649523939438 | 0.523 |
| 0.21064767292186026 | 0.674 |
| 0.06381016637087034 | 0.903 |
| 0.19693022350740452 | 0.605 |
| 0.6136420785297441 | 0.795 |
| 0.3280129283603531 | 0.483 |
| 0.38381793315481916 | 0.39 |
| 0.6021335688002457 | 0.689 |
| 0.14618698967049082 | 0.491 |
| 0.3432632600420006 | 0.442 |
| 0.2941670625898847 | 0.438 |
| 0.2693108067622233 | 0.423 |
| 0.15108067006728298 | 0.427 |
| 0.17882540710618944 | 0.372 |
| 0.0680625910994499 | 0.662 |
| 0.5891457817495911 | 0.711 |
| 0.1395813469327044 | 0.228 |
| 0.08760799449456136 | 0.175 |
| 0.6830286873948614 | 0.816 |
| 0.26364234090181904 | 0.494 |
| 0.4420139391493705 | 0.585 |
| 0.4762343318362251 | 0.514 |
| 0.23160096429885035 | 0.739 |
| 0.5951986444817354 | 0.6 |
| 0.02642295198682254 | 0.415 |
| 0.366694876707104 | 0.771 |
| 0.06388168578761133 | 0.235 |
| 0.20135145735852222 | 0.374 |
| 0.2991408584941274 | 0.877 |
| 0.1962328076477039 | 0.45 |
| 0.45175418295867353 | 0.835 |
| 0.12395209155854381 | 0.579 |
| 0.04615858732047651 | 0.436 |
| 0.022901786488770948 | 0.598 |
| 0.46442629178811246 | 0.525 |
| 0.11623750248529519 | 0.207 |
| 0.19061538629572605 | 0.543 |
| 0.05000380965007001 | 0.525 |
| 0.5308809831949715 | 0.625 |
| 0.0015183047796053506 | 0.897 |
| 0.043341422100606986 | 0.055 |
| 0.10392313792960672 | 0.134 |
| 0.40930868779765095 | 0.549 |
| 0.15035688874057562 | 0.554 |
| 0.13676843321326115 | 0.487 |
| 0.037049389996850035 | 0.181 |
| 0.528831238788524 | 0.713 |
| 0.18970891525920885 | 0.25 |
| 0.4227076183640136 | 0.904 |
| 0.15547546877392826 | 0.379 |
| 0.24080887478452417 | 0.328 |
| 0.29044834481175663 | 0.46 |
| 0.09509535568471061 | 0.301 |
| 0.08923455351917031 | 0.201 |
| 0.2163465727122298 | 0.474 |
| 0.5118524221619861 | 0.547 |
| 0.029112490615460618 | 0.315 |
| 0.005654325553432704 | 0.39 |
| 0.21505261337076476 | 0.825 |
| 0.30687175858769233 | 0.37 |
| 0.5573871760789255 | 0.927 |
| 0.33263097670679 | 0.727 |
| 0.007706002539720425 | 0.768 |
| 0.22116261314201902 | 0.429 |
| 0.3579272567395988 | 0.463 |
| 0.25137258692366415 | 0.292 |
| 0.28615194623855733 | 0.385 |
| 0.11705082880568207 | 0.648 |
| 0.787470500710126 | 0.864 |
| 0.618746551481772 | 0.854 |
| 0.2425074009996795 | 0.516 |
| 0.07679095775026401 | 0.81 |
| 0.000237970132580978 | 0.627 |
| 0.0405795889383983 | 0.08 |
| 0.14125514149154428 | 0.696 |
| 0.386177216335009 | 0.418 |
| 0.06256913770337147 | 0.478 |
| 0.2964179192380314 | 0.643 |
| 0.14758745631714465 | 0.369 |
| 0.1311538117673472 | 0.65 |
| 0.4864547532919 | 0.732 |
| 0.48046903271926444 | 0.704 |
| 0.5131161565220846 | 0.526 |
| 0.011094376691876073 | 0.72 |
| 0.3311121919304164 | 0.406 |
| 0.09028587586391257 | 0.75 |
| 0.23338529384293916 | 0.359 |
| 0.3973902506694914 | 0.679 |
| 0.3164987039275916 | 0.617 |
| 0.45905280282576866 | 0.585 |
| 0.007297404815401642 | 0.646 |
| 0.23243466320249462 | 0.32 |
| 0.2629451819524171 | 0.601 |
| 0.339936710057809 | 0.343 |
| 0.3345722266337817 | 0.345 |
| 0.4131366350952278 | 0.643 |
| 0.13217180118353644 | 0.667 |
| 0.09458518385859249 | 0.611 |
| 0.08984404741754859 | 0.098 |
| 0.15763585688771842 | 0.479 |
| 0.3573887357895962 | 0.567 |
| 0.09271094012878789 | 0.891 |
| 0.32287581654174513 | 0.36 |
| 0.11263076048352871 | 0.808 |
| 0.5758313750398796 | 0.763 |
| 0.20861071779696494 | 0.804 |
| 0.06032284281698119 | 0.293 |
| 0.06469604063821055 | 0.168 |
| 0.21173746967691498 | 0.322 |
| 0.11761146848158499 | 0.192 |
| 0.4133151092531199 | 0.634 |
| 0.08175235599857145 | 0.639 |
| 0.13760247563359473 | 0.286 |
| 0.2631251597854709 | 0.795 |
| 0.07635932193361727 | 0.163 |
| 0.04009194346541356 | 0.195 |
| 0.02808519904063589 | 0.752 |
| 0.346708587832805 | 0.437 |
| 0.3137050919448905 | 0.694 |
| 0.24331354033982056 | 0.436 |
| 0.2598365327164026 | 0.314 |
| 0.009944237082342822 | 0.107 |
| 0.38226959978600206 | 0.82 |
| 0.489058187540948 | 0.686 |
| 0.6448653956282138 | 0.799 |
| 0.17489625288400212 | 0.398 |
| 0.20710008550940617 | 0.26 |
| 0.11410638041839616 | 0.687 |
| 0.2190285223566586 | 0.606 |
| 0.37887893941774653 | 0.602 |
| 0.7055448275736885 | 0.753 |
| 0.06019162628817065 | 0.73 |
| 0.4247979236527484 | 0.63 |
| 0.0035793716655985186 | 0.462 |
| 0.19830209993533732 | 0.334 |
| 0.4650314336389353 | 0.523 |
| 0.32661444895915226 | 0.729 |
| 0.4955166123375436 | 0.696 |
| 0.36591197973729117 | 0.388 |
| 0.08744477430815178 | 0.213 |
| 0.3617002607140103 | 0.393 |
| 0.06590447071416317 | 0.225 |
| 0.7972647474089039 | 0.863 |
| 0.14384738977668432 | 0.36 |
| 0.21316887096155324 | 0.429 |
| 0.18891010888698034 | 0.292 |
| 0.18642062720251718 | 0.489 |
| 0.22758067999713072 | 0.274 |
| 0.5294892287932863 | 0.74 |
| 0.3042044179118113 | 0.46 |
| 0.35310372773253873 | 0.674 |
| 0.32805859998835585 | 0.494 |
| 0.13693057936101705 | 0.61 |
| 0.5484072585618218 | 0.647 |
| 0.6722984619943998 | 0.877 |
| 0.04466321330970202 | 0.744 |
| 0.350691331046044 | 0.711 |
| 0.3807613291480655 | 0.542 |
| 0.0992610294100269 | 0.661 |
| 0.5375394372093558 | 0.717 |
| 0.35411748310376157 | 0.39 |